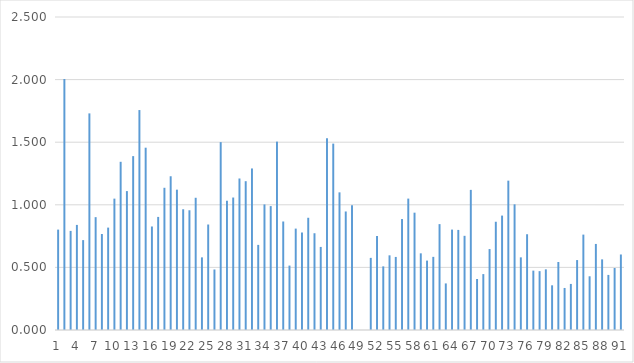
| Category | 1 |
|---|---|
| 0 | 0.802 |
| 1 | 2.005 |
| 2 | 0.792 |
| 3 | 0.839 |
| 4 | 0.718 |
| 5 | 1.73 |
| 6 | 0.901 |
| 7 | 0.767 |
| 8 | 0.818 |
| 9 | 1.049 |
| 10 | 1.343 |
| 11 | 1.109 |
| 12 | 1.389 |
| 13 | 1.757 |
| 14 | 1.456 |
| 15 | 0.827 |
| 16 | 0.903 |
| 17 | 1.136 |
| 18 | 1.228 |
| 19 | 1.121 |
| 20 | 0.964 |
| 21 | 0.956 |
| 22 | 1.056 |
| 23 | 0.58 |
| 24 | 0.843 |
| 25 | 0.483 |
| 26 | 1.501 |
| 27 | 1.032 |
| 28 | 1.058 |
| 29 | 1.21 |
| 30 | 1.189 |
| 31 | 1.29 |
| 32 | 0.68 |
| 33 | 1.003 |
| 34 | 0.99 |
| 35 | 1.505 |
| 36 | 0.867 |
| 37 | 0.515 |
| 38 | 0.81 |
| 39 | 0.778 |
| 40 | 0.896 |
| 41 | 0.773 |
| 42 | 0.664 |
| 43 | 1.532 |
| 44 | 1.489 |
| 45 | 1.099 |
| 46 | 0.947 |
| 47 | 0.997 |
| 48 | 0 |
| 49 | 0 |
| 50 | 0.576 |
| 51 | 0.751 |
| 52 | 0.508 |
| 53 | 0.596 |
| 54 | 0.584 |
| 55 | 0.886 |
| 56 | 1.05 |
| 57 | 0.937 |
| 58 | 0.612 |
| 59 | 0.554 |
| 60 | 0.584 |
| 61 | 0.846 |
| 62 | 0.372 |
| 63 | 0.802 |
| 64 | 0.799 |
| 65 | 0.752 |
| 66 | 1.119 |
| 67 | 0.407 |
| 68 | 0.447 |
| 69 | 0.646 |
| 70 | 0.865 |
| 71 | 0.914 |
| 72 | 1.193 |
| 73 | 1.004 |
| 74 | 0.58 |
| 75 | 0.765 |
| 76 | 0.474 |
| 77 | 0.47 |
| 78 | 0.484 |
| 79 | 0.357 |
| 80 | 0.543 |
| 81 | 0.336 |
| 82 | 0.368 |
| 83 | 0.559 |
| 84 | 0.762 |
| 85 | 0.429 |
| 86 | 0.687 |
| 87 | 0.564 |
| 88 | 0.44 |
| 89 | 0.495 |
| 90 | 0.603 |